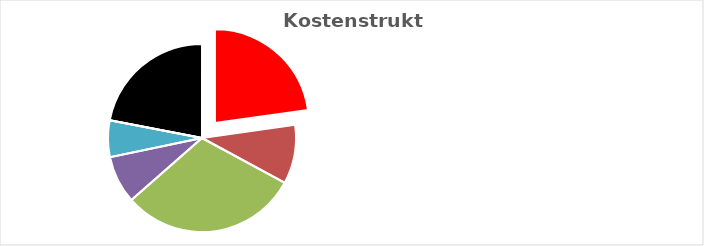
| Category | Series 0 |
|---|---|
| KV-Entgelt produktiv Tätige | 1 |
| Weitere Personalkosten produktiv | 0.446 |
| Personalnebenkosten | 1.346 |
| Unproduktives Personal | 0.36 |
| Deckung Personalgemeinkosten | 0.276 |
| Umlagen ohne GZ | 0 |
| Gesamtzuschlag | 0.966 |